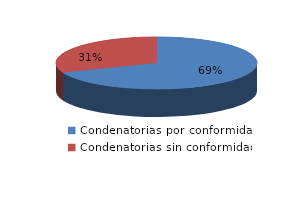
| Category | Series 0 |
|---|---|
| 0 | 1440 |
| 1 | 646 |